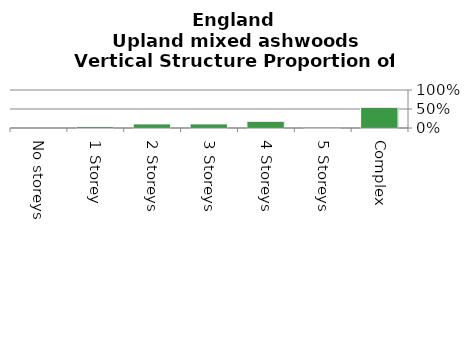
| Category | Upland mixed ashwoods |
|---|---|
| No storeys | 0 |
| 1 Storey | 0.038 |
| 2 Storeys | 0.108 |
| 3 Storeys | 0.108 |
| 4 Storeys | 0.177 |
| 5 Storeys | 0.023 |
| Complex | 0.545 |